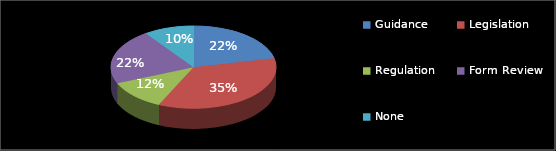
| Category | Series 0 |
|---|---|
| Guidance | 11 |
| Legislation | 18 |
| Regulation | 6 |
| Form Review | 11 |
| None | 5 |